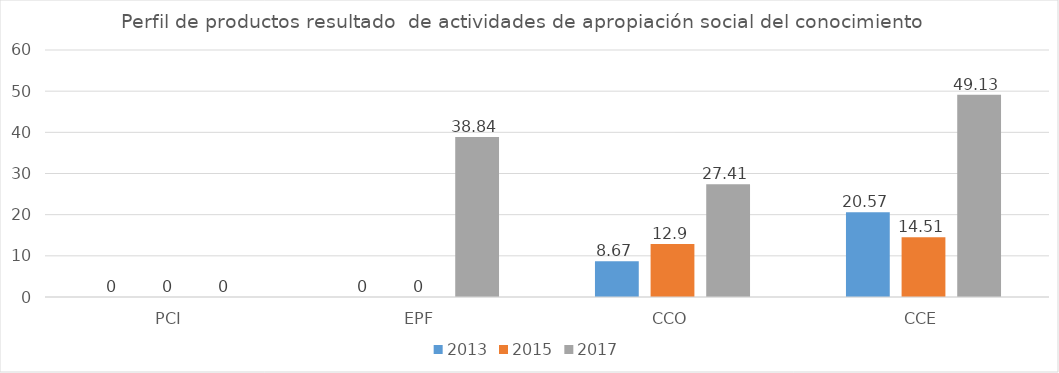
| Category | 2013 | 2015 | 2017 |
|---|---|---|---|
| PCI | 0 | 0 | 0 |
| EPF | 0 | 0 | 38.84 |
| CCO | 8.67 | 12.9 | 27.41 |
| CCE | 20.57 | 14.51 | 49.13 |